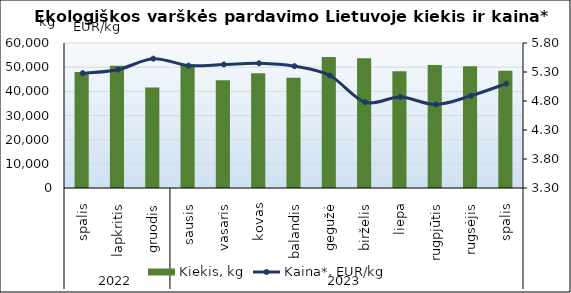
| Category | Kiekis, kg |
|---|---|
| 0 | 47995 |
| 1 | 50586 |
| 2 | 41573 |
| 3 | 51074 |
| 4 | 44609 |
| 5 | 47506 |
| 6 | 45656 |
| 7 | 54234 |
| 8 | 53714 |
| 9 | 48290 |
| 10 | 50925 |
| 11 | 50428 |
| 12 | 48540 |